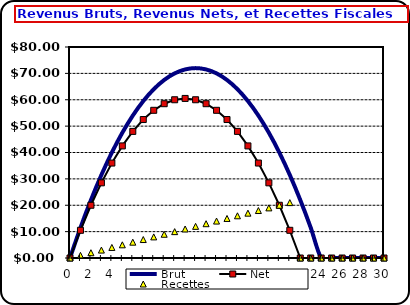
| Category | Brut | Net | Recettes |
|---|---|---|---|
| 0.0 | 0 | 0 | 0 |
| 1.0 | 11.5 | 10.5 | 1 |
| 2.0 | 22 | 20 | 2 |
| 3.0 | 31.5 | 28.5 | 3 |
| 4.0 | 40 | 36 | 4 |
| 5.0 | 47.5 | 42.5 | 5 |
| 6.0 | 54 | 48 | 6 |
| 7.0 | 59.5 | 52.5 | 7 |
| 8.0 | 64 | 56 | 8 |
| 9.0 | 67.5 | 58.5 | 9 |
| 10.0 | 70 | 60 | 10 |
| 11.0 | 71.5 | 60.5 | 11 |
| 12.0 | 72 | 60 | 12 |
| 13.0 | 71.5 | 58.5 | 13 |
| 14.0 | 70 | 56 | 14 |
| 15.0 | 67.5 | 52.5 | 15 |
| 16.0 | 64 | 48 | 16 |
| 17.0 | 59.5 | 42.5 | 17 |
| 18.0 | 54 | 36 | 18 |
| 19.0 | 47.5 | 28.5 | 19 |
| 20.0 | 40 | 20 | 20 |
| 21.0 | 31.5 | 10.5 | 21 |
| 22.0 | 22 | 0 | 0 |
| 23.0 | 11.5 | 0 | 0 |
| 24.0 | 0 | 0 | 0 |
| 25.0 | 0 | 0 | 0 |
| 26.0 | 0 | 0 | 0 |
| 27.0 | 0 | 0 | 0 |
| 28.0 | 0 | 0 | 0 |
| 29.0 | 0 | 0 | 0 |
| 30.0 | 0 | 0 | 0 |